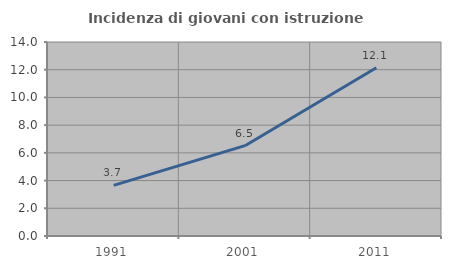
| Category | Incidenza di giovani con istruzione universitaria |
|---|---|
| 1991.0 | 3.656 |
| 2001.0 | 6.518 |
| 2011.0 | 12.146 |